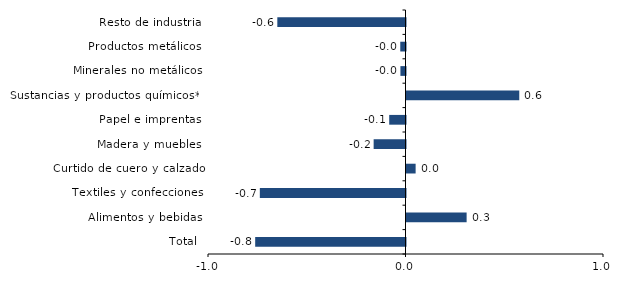
| Category | Series 0 |
|---|---|
| Total | -0.761 |
| Alimentos y bebidas | 0.304 |
| Textiles y confecciones | -0.738 |
| Curtido de cuero y calzado | 0.046 |
| Madera y muebles | -0.161 |
| Papel e imprentas | -0.083 |
| Sustancias y productos químicos** | 0.571 |
| Minerales no metálicos | -0.026 |
| Productos metálicos | -0.027 |
| Resto de industria | -0.649 |